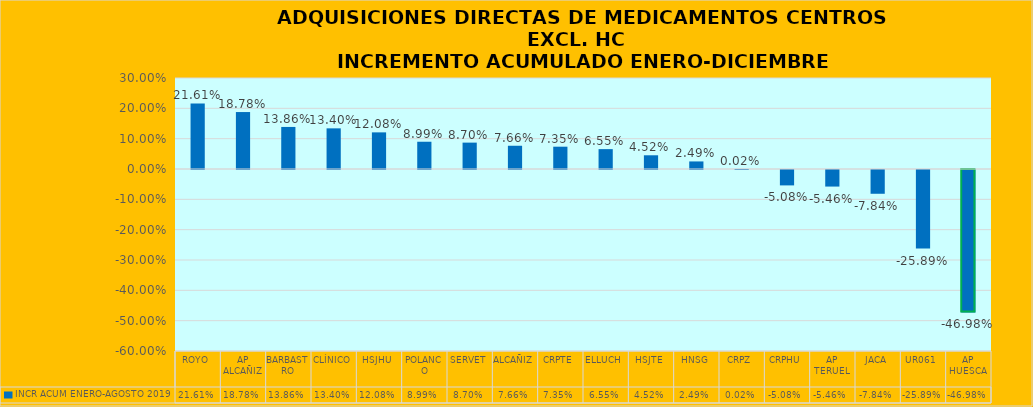
| Category | INCR ACUM ENERO-AGOSTO 2019 |
|---|---|
| ROYO | 0.216 |
| AP ALCAÑIZ | 0.188 |
| BARBASTRO | 0.139 |
| CLÍNICO | 0.134 |
| HSJHU | 0.121 |
| POLANCO | 0.09 |
| SERVET | 0.087 |
| ALCAÑIZ | 0.077 |
| CRPTE | 0.074 |
| ELLUCH | 0.066 |
| HSJTE | 0.045 |
| HNSG | 0.025 |
| CRPZ | 0 |
| CRPHU | -0.051 |
| AP TERUEL | -0.055 |
| JACA | -0.078 |
| UR061 | -0.259 |
| AP HUESCA | -0.47 |